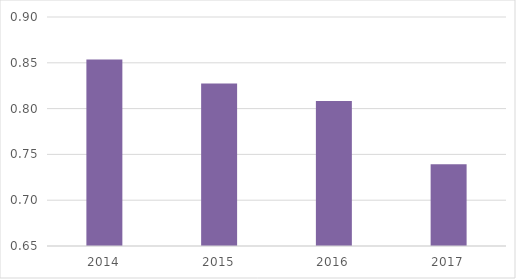
| Category | ККСК |
|---|---|
| 2014.0 | 0.854 |
| 2015.0 | 0.827 |
| 2016.0 | 0.808 |
| 2017.0 | 0.739 |